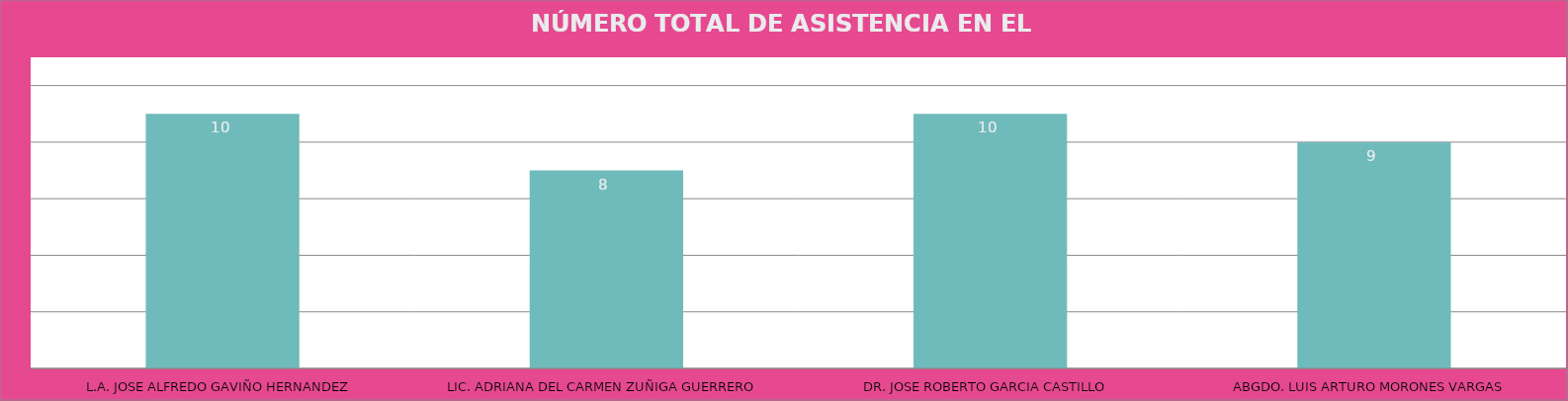
| Category | L.A. JOSE ALFREDO GAVIÑO HERNANDEZ |
|---|---|
| L.A. JOSE ALFREDO GAVIÑO HERNANDEZ | 10 |
| LIC. ADRIANA DEL CARMEN ZUÑIGA GUERRERO | 8 |
| DR. JOSE ROBERTO GARCIA CASTILLO | 10 |
| ABGDO. LUIS ARTURO MORONES VARGAS | 9 |